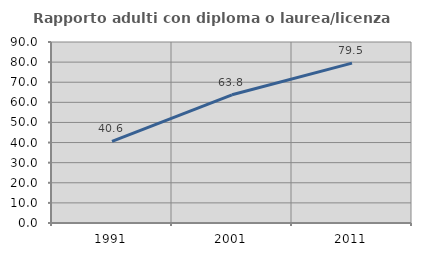
| Category | Rapporto adulti con diploma o laurea/licenza media  |
|---|---|
| 1991.0 | 40.632 |
| 2001.0 | 63.758 |
| 2011.0 | 79.474 |